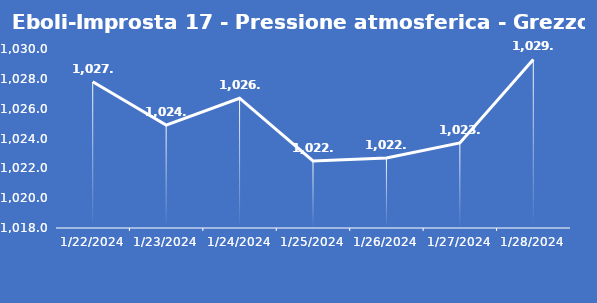
| Category | Eboli-Improsta 17 - Pressione atmosferica - Grezzo (hPa) |
|---|---|
| 1/22/24 | 1027.8 |
| 1/23/24 | 1024.9 |
| 1/24/24 | 1026.7 |
| 1/25/24 | 1022.5 |
| 1/26/24 | 1022.7 |
| 1/27/24 | 1023.7 |
| 1/28/24 | 1029.3 |